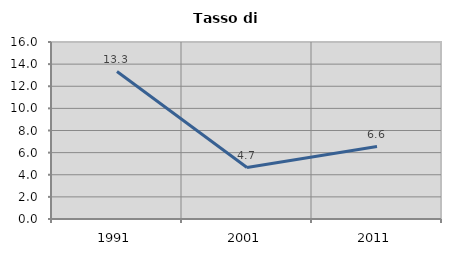
| Category | Tasso di disoccupazione   |
|---|---|
| 1991.0 | 13.333 |
| 2001.0 | 4.651 |
| 2011.0 | 6.552 |